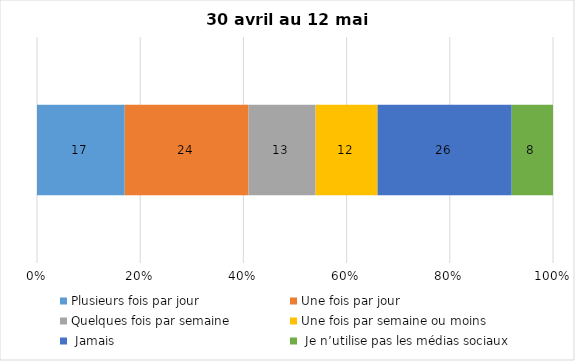
| Category | Plusieurs fois par jour | Une fois par jour | Quelques fois par semaine   | Une fois par semaine ou moins   |  Jamais   |  Je n’utilise pas les médias sociaux |
|---|---|---|---|---|---|---|
| 0 | 17 | 24 | 13 | 12 | 26 | 8 |